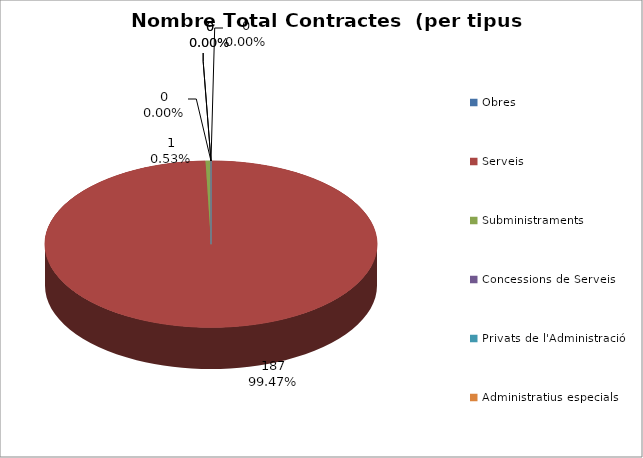
| Category | Nombre Total Contractes |
|---|---|
| Obres | 0 |
| Serveis | 187 |
| Subministraments | 1 |
| Concessions de Serveis | 0 |
| Privats de l'Administració | 0 |
| Administratius especials | 0 |